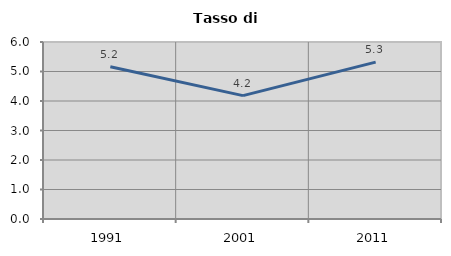
| Category | Tasso di disoccupazione   |
|---|---|
| 1991.0 | 5.162 |
| 2001.0 | 4.183 |
| 2011.0 | 5.319 |